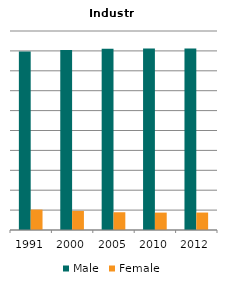
| Category | Male | Female |
|---|---|---|
| 1991.0 | 0.897 | 0.103 |
| 2000.0 | 0.904 | 0.096 |
| 2005.0 | 0.911 | 0.089 |
| 2010.0 | 0.913 | 0.087 |
| 2012.0 | 0.912 | 0.088 |